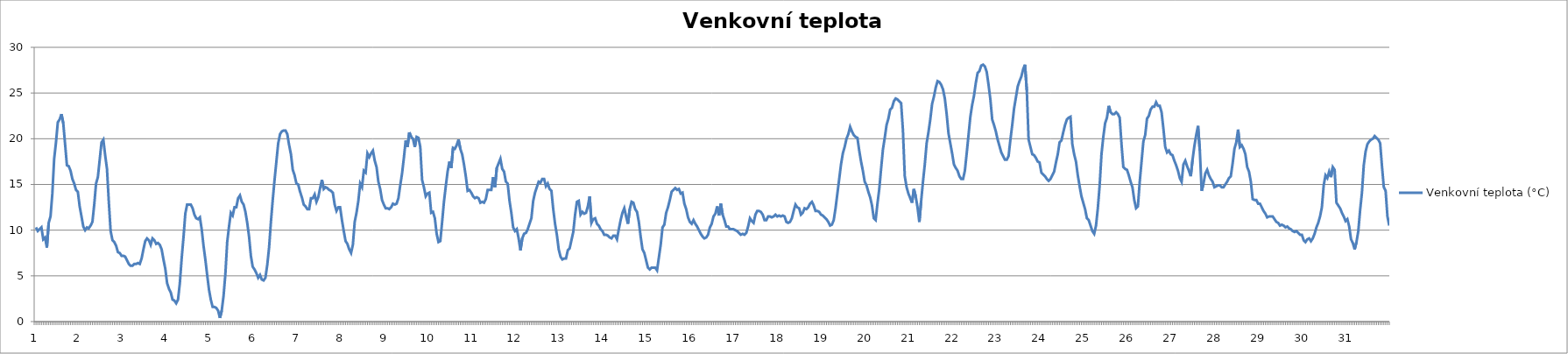
| Category | Venkovní teplota (°C) |
|---|---|
| 0 | 10.3 |
| 1 | 9.9 |
| 2 | 10.1 |
| 3 | 10.3 |
| 4 | 9 |
| 5 | 9.2 |
| 6 | 8.1 |
| 7 | 10.8 |
| 8 | 11.5 |
| 9 | 14 |
| 10 | 17.8 |
| 11 | 19.6 |
| 12 | 21.8 |
| 13 | 22.1 |
| 14 | 22.7 |
| 15 | 21.7 |
| 16 | 19.4 |
| 17 | 17.1 |
| 18 | 17 |
| 19 | 16.5 |
| 20 | 15.6 |
| 21 | 15.1 |
| 22 | 14.4 |
| 23 | 14.2 |
| 24 | 12.6 |
| 25 | 11.5 |
| 26 | 10.4 |
| 27 | 10 |
| 28 | 10.3 |
| 29 | 10.2 |
| 30 | 10.5 |
| 31 | 10.9 |
| 32 | 12.8 |
| 33 | 15.1 |
| 34 | 15.8 |
| 35 | 17.7 |
| 36 | 19.6 |
| 37 | 19.9 |
| 38 | 18.2 |
| 39 | 16.7 |
| 40 | 13.1 |
| 41 | 9.9 |
| 42 | 8.9 |
| 43 | 8.7 |
| 44 | 8.3 |
| 45 | 7.6 |
| 46 | 7.5 |
| 47 | 7.2 |
| 48 | 7.2 |
| 49 | 7.1 |
| 50 | 6.7 |
| 51 | 6.3 |
| 52 | 6.1 |
| 53 | 6.1 |
| 54 | 6.3 |
| 55 | 6.3 |
| 56 | 6.4 |
| 57 | 6.3 |
| 58 | 6.9 |
| 59 | 7.9 |
| 60 | 8.8 |
| 61 | 9.1 |
| 62 | 8.9 |
| 63 | 8.4 |
| 64 | 9.1 |
| 65 | 8.9 |
| 66 | 8.5 |
| 67 | 8.6 |
| 68 | 8.4 |
| 69 | 7.9 |
| 70 | 6.8 |
| 71 | 5.8 |
| 72 | 4.2 |
| 73 | 3.6 |
| 74 | 3.2 |
| 75 | 2.4 |
| 76 | 2.3 |
| 77 | 2 |
| 78 | 2.4 |
| 79 | 4.2 |
| 80 | 6.9 |
| 81 | 9.2 |
| 82 | 11.8 |
| 83 | 12.8 |
| 84 | 12.8 |
| 85 | 12.8 |
| 86 | 12.4 |
| 87 | 11.7 |
| 88 | 11.3 |
| 89 | 11.2 |
| 90 | 11.4 |
| 91 | 10.1 |
| 92 | 8.3 |
| 93 | 6.8 |
| 94 | 5.1 |
| 95 | 3.5 |
| 96 | 2.4 |
| 97 | 1.6 |
| 98 | 1.6 |
| 99 | 1.5 |
| 100 | 1.2 |
| 101 | 0.4 |
| 102 | 1.2 |
| 103 | 2.8 |
| 104 | 5.2 |
| 105 | 8.7 |
| 106 | 10.4 |
| 107 | 11.9 |
| 108 | 11.6 |
| 109 | 12.5 |
| 110 | 12.5 |
| 111 | 13.5 |
| 112 | 13.8 |
| 113 | 13.1 |
| 114 | 12.8 |
| 115 | 12 |
| 116 | 10.8 |
| 117 | 9.3 |
| 118 | 7.2 |
| 119 | 6 |
| 120 | 5.7 |
| 121 | 5.3 |
| 122 | 4.8 |
| 123 | 5.1 |
| 124 | 4.6 |
| 125 | 4.5 |
| 126 | 4.8 |
| 127 | 6.2 |
| 128 | 8.1 |
| 129 | 10.9 |
| 130 | 13.3 |
| 131 | 15.5 |
| 132 | 17.5 |
| 133 | 19.5 |
| 134 | 20.5 |
| 135 | 20.8 |
| 136 | 20.9 |
| 137 | 20.9 |
| 138 | 20.5 |
| 139 | 19.3 |
| 140 | 18.3 |
| 141 | 16.6 |
| 142 | 16 |
| 143 | 15.1 |
| 144 | 15 |
| 145 | 14.2 |
| 146 | 13.6 |
| 147 | 12.8 |
| 148 | 12.6 |
| 149 | 12.3 |
| 150 | 12.3 |
| 151 | 13.5 |
| 152 | 13.5 |
| 153 | 13.9 |
| 154 | 13.1 |
| 155 | 13.6 |
| 156 | 14.6 |
| 157 | 15.5 |
| 158 | 14.5 |
| 159 | 14.7 |
| 160 | 14.6 |
| 161 | 14.4 |
| 162 | 14.3 |
| 163 | 14.1 |
| 164 | 12.8 |
| 165 | 12.1 |
| 166 | 12.5 |
| 167 | 12.5 |
| 168 | 11.1 |
| 169 | 9.9 |
| 170 | 8.8 |
| 171 | 8.5 |
| 172 | 7.9 |
| 173 | 7.5 |
| 174 | 8.4 |
| 175 | 10.9 |
| 176 | 11.9 |
| 177 | 13.2 |
| 178 | 15.1 |
| 179 | 14.7 |
| 180 | 16.5 |
| 181 | 16.3 |
| 182 | 18.4 |
| 183 | 18 |
| 184 | 18.4 |
| 185 | 18.7 |
| 186 | 17.6 |
| 187 | 16.9 |
| 188 | 15.3 |
| 189 | 14.5 |
| 190 | 13.3 |
| 191 | 12.8 |
| 192 | 12.4 |
| 193 | 12.4 |
| 194 | 12.3 |
| 195 | 12.5 |
| 196 | 12.9 |
| 197 | 12.8 |
| 198 | 12.9 |
| 199 | 13.5 |
| 200 | 14.9 |
| 201 | 16.2 |
| 202 | 17.9 |
| 203 | 19.8 |
| 204 | 19.1 |
| 205 | 20.7 |
| 206 | 20.2 |
| 207 | 20 |
| 208 | 19.1 |
| 209 | 20.2 |
| 210 | 20.1 |
| 211 | 19.1 |
| 212 | 15.5 |
| 213 | 14.7 |
| 214 | 13.7 |
| 215 | 14 |
| 216 | 14.1 |
| 217 | 11.9 |
| 218 | 12 |
| 219 | 11.3 |
| 220 | 9.6 |
| 221 | 8.7 |
| 222 | 8.8 |
| 223 | 10.9 |
| 224 | 13.1 |
| 225 | 14.8 |
| 226 | 16.4 |
| 227 | 17.5 |
| 228 | 16.8 |
| 229 | 19 |
| 230 | 18.9 |
| 231 | 19.3 |
| 232 | 19.9 |
| 233 | 18.9 |
| 234 | 18.3 |
| 235 | 17.2 |
| 236 | 15.9 |
| 237 | 14.3 |
| 238 | 14.4 |
| 239 | 14.1 |
| 240 | 13.7 |
| 241 | 13.5 |
| 242 | 13.6 |
| 243 | 13.5 |
| 244 | 13 |
| 245 | 13.1 |
| 246 | 13 |
| 247 | 13.4 |
| 248 | 14.4 |
| 249 | 14.4 |
| 250 | 14.4 |
| 251 | 15.8 |
| 252 | 14.7 |
| 253 | 16.8 |
| 254 | 17.3 |
| 255 | 17.8 |
| 256 | 16.7 |
| 257 | 16.4 |
| 258 | 15.3 |
| 259 | 15.1 |
| 260 | 13.2 |
| 261 | 11.9 |
| 262 | 10.3 |
| 263 | 9.9 |
| 264 | 10.1 |
| 265 | 9.1 |
| 266 | 7.8 |
| 267 | 9.1 |
| 268 | 9.6 |
| 269 | 9.7 |
| 270 | 10.1 |
| 271 | 10.7 |
| 272 | 11.3 |
| 273 | 13.2 |
| 274 | 14.1 |
| 275 | 14.7 |
| 276 | 15.3 |
| 277 | 15.2 |
| 278 | 15.6 |
| 279 | 15.6 |
| 280 | 14.8 |
| 281 | 15.1 |
| 282 | 14.5 |
| 283 | 14.3 |
| 284 | 12.3 |
| 285 | 10.7 |
| 286 | 9.5 |
| 287 | 7.9 |
| 288 | 7.1 |
| 289 | 6.8 |
| 290 | 6.9 |
| 291 | 6.9 |
| 292 | 7.8 |
| 293 | 8 |
| 294 | 8.9 |
| 295 | 9.8 |
| 296 | 11.7 |
| 297 | 13.1 |
| 298 | 13.2 |
| 299 | 11.7 |
| 300 | 12 |
| 301 | 11.8 |
| 302 | 11.9 |
| 303 | 12.6 |
| 304 | 13.7 |
| 305 | 10.8 |
| 306 | 11.2 |
| 307 | 11.3 |
| 308 | 10.7 |
| 309 | 10.5 |
| 310 | 10.1 |
| 311 | 9.9 |
| 312 | 9.5 |
| 313 | 9.5 |
| 314 | 9.4 |
| 315 | 9.2 |
| 316 | 9.1 |
| 317 | 9.4 |
| 318 | 9.4 |
| 319 | 9 |
| 320 | 10.1 |
| 321 | 11.1 |
| 322 | 11.9 |
| 323 | 12.4 |
| 324 | 11.5 |
| 325 | 10.7 |
| 326 | 12.3 |
| 327 | 13.1 |
| 328 | 13 |
| 329 | 12.3 |
| 330 | 12 |
| 331 | 10.9 |
| 332 | 9.3 |
| 333 | 7.9 |
| 334 | 7.5 |
| 335 | 6.7 |
| 336 | 5.9 |
| 337 | 5.7 |
| 338 | 5.9 |
| 339 | 5.9 |
| 340 | 5.9 |
| 341 | 5.6 |
| 342 | 7 |
| 343 | 8.4 |
| 344 | 10.3 |
| 345 | 10.6 |
| 346 | 11.9 |
| 347 | 12.5 |
| 348 | 13.3 |
| 349 | 14.2 |
| 350 | 14.4 |
| 351 | 14.6 |
| 352 | 14.4 |
| 353 | 14.5 |
| 354 | 14 |
| 355 | 14.1 |
| 356 | 12.9 |
| 357 | 12.3 |
| 358 | 11.4 |
| 359 | 10.9 |
| 360 | 10.7 |
| 361 | 11.1 |
| 362 | 10.7 |
| 363 | 10.4 |
| 364 | 10 |
| 365 | 9.6 |
| 366 | 9.3 |
| 367 | 9.1 |
| 368 | 9.2 |
| 369 | 9.5 |
| 370 | 10.3 |
| 371 | 10.7 |
| 372 | 11.5 |
| 373 | 11.8 |
| 374 | 12.6 |
| 375 | 11.6 |
| 376 | 12.9 |
| 377 | 11.7 |
| 378 | 11.1 |
| 379 | 10.4 |
| 380 | 10.4 |
| 381 | 10.1 |
| 382 | 10.1 |
| 383 | 10.1 |
| 384 | 10 |
| 385 | 9.9 |
| 386 | 9.7 |
| 387 | 9.5 |
| 388 | 9.6 |
| 389 | 9.5 |
| 390 | 9.7 |
| 391 | 10.4 |
| 392 | 11.3 |
| 393 | 11 |
| 394 | 10.8 |
| 395 | 11.7 |
| 396 | 12.1 |
| 397 | 12.1 |
| 398 | 12 |
| 399 | 11.7 |
| 400 | 11.1 |
| 401 | 11.1 |
| 402 | 11.5 |
| 403 | 11.5 |
| 404 | 11.4 |
| 405 | 11.5 |
| 406 | 11.7 |
| 407 | 11.5 |
| 408 | 11.6 |
| 409 | 11.5 |
| 410 | 11.6 |
| 411 | 11.5 |
| 412 | 10.9 |
| 413 | 10.8 |
| 414 | 10.9 |
| 415 | 11.3 |
| 416 | 12.1 |
| 417 | 12.8 |
| 418 | 12.5 |
| 419 | 12.4 |
| 420 | 11.7 |
| 421 | 11.9 |
| 422 | 12.4 |
| 423 | 12.3 |
| 424 | 12.5 |
| 425 | 12.9 |
| 426 | 13.1 |
| 427 | 12.7 |
| 428 | 12.1 |
| 429 | 12.1 |
| 430 | 12 |
| 431 | 11.7 |
| 432 | 11.6 |
| 433 | 11.4 |
| 434 | 11.2 |
| 435 | 10.9 |
| 436 | 10.5 |
| 437 | 10.6 |
| 438 | 11.1 |
| 439 | 12.4 |
| 440 | 14 |
| 441 | 15.6 |
| 442 | 17.2 |
| 443 | 18.4 |
| 444 | 19.1 |
| 445 | 20 |
| 446 | 20.5 |
| 447 | 21.3 |
| 448 | 20.8 |
| 449 | 20.4 |
| 450 | 20.2 |
| 451 | 20.1 |
| 452 | 18.7 |
| 453 | 17.5 |
| 454 | 16.5 |
| 455 | 15.3 |
| 456 | 14.9 |
| 457 | 14.2 |
| 458 | 13.6 |
| 459 | 12.7 |
| 460 | 11.3 |
| 461 | 11.1 |
| 462 | 12.9 |
| 463 | 14.5 |
| 464 | 16.7 |
| 465 | 18.8 |
| 466 | 20.1 |
| 467 | 21.5 |
| 468 | 22.2 |
| 469 | 23.2 |
| 470 | 23.4 |
| 471 | 24.1 |
| 472 | 24.4 |
| 473 | 24.3 |
| 474 | 24.1 |
| 475 | 23.9 |
| 476 | 20.9 |
| 477 | 15.9 |
| 478 | 14.7 |
| 479 | 14 |
| 480 | 13.5 |
| 481 | 13 |
| 482 | 14.5 |
| 483 | 13.7 |
| 484 | 12.5 |
| 485 | 10.9 |
| 486 | 13.2 |
| 487 | 15.3 |
| 488 | 17.2 |
| 489 | 19.5 |
| 490 | 20.7 |
| 491 | 22.1 |
| 492 | 23.8 |
| 493 | 24.6 |
| 494 | 25.6 |
| 495 | 26.3 |
| 496 | 26.2 |
| 497 | 25.9 |
| 498 | 25.4 |
| 499 | 24.4 |
| 500 | 22.7 |
| 501 | 20.6 |
| 502 | 19.5 |
| 503 | 18.4 |
| 504 | 17.2 |
| 505 | 16.8 |
| 506 | 16.5 |
| 507 | 15.9 |
| 508 | 15.6 |
| 509 | 15.6 |
| 510 | 16.5 |
| 511 | 18.4 |
| 512 | 20.4 |
| 513 | 22.4 |
| 514 | 23.7 |
| 515 | 24.7 |
| 516 | 26.1 |
| 517 | 27.2 |
| 518 | 27.4 |
| 519 | 28 |
| 520 | 28.1 |
| 521 | 27.9 |
| 522 | 27.3 |
| 523 | 25.9 |
| 524 | 24.3 |
| 525 | 22.1 |
| 526 | 21.5 |
| 527 | 20.8 |
| 528 | 19.9 |
| 529 | 19.2 |
| 530 | 18.5 |
| 531 | 18.1 |
| 532 | 17.7 |
| 533 | 17.7 |
| 534 | 18.1 |
| 535 | 19.9 |
| 536 | 21.5 |
| 537 | 23.3 |
| 538 | 24.5 |
| 539 | 25.7 |
| 540 | 26.3 |
| 541 | 26.8 |
| 542 | 27.6 |
| 543 | 28.1 |
| 544 | 25.3 |
| 545 | 19.9 |
| 546 | 19.1 |
| 547 | 18.3 |
| 548 | 18.2 |
| 549 | 17.9 |
| 550 | 17.5 |
| 551 | 17.4 |
| 552 | 16.3 |
| 553 | 16.1 |
| 554 | 15.9 |
| 555 | 15.6 |
| 556 | 15.4 |
| 557 | 15.6 |
| 558 | 16 |
| 559 | 16.4 |
| 560 | 17.4 |
| 561 | 18.3 |
| 562 | 19.6 |
| 563 | 19.8 |
| 564 | 20.7 |
| 565 | 21.5 |
| 566 | 22.1 |
| 567 | 22.3 |
| 568 | 22.4 |
| 569 | 19.4 |
| 570 | 18.3 |
| 571 | 17.5 |
| 572 | 16 |
| 573 | 14.8 |
| 574 | 13.7 |
| 575 | 13 |
| 576 | 12.3 |
| 577 | 11.3 |
| 578 | 11.1 |
| 579 | 10.5 |
| 580 | 9.9 |
| 581 | 9.6 |
| 582 | 10.5 |
| 583 | 12.4 |
| 584 | 14.9 |
| 585 | 18.3 |
| 586 | 20.2 |
| 587 | 21.7 |
| 588 | 22.3 |
| 589 | 23.6 |
| 590 | 22.9 |
| 591 | 22.7 |
| 592 | 22.7 |
| 593 | 22.9 |
| 594 | 22.7 |
| 595 | 22.3 |
| 596 | 19.4 |
| 597 | 16.9 |
| 598 | 16.7 |
| 599 | 16.6 |
| 600 | 16 |
| 601 | 15.3 |
| 602 | 14.7 |
| 603 | 13.3 |
| 604 | 12.4 |
| 605 | 12.6 |
| 606 | 15.3 |
| 607 | 17.5 |
| 608 | 19.7 |
| 609 | 20.4 |
| 610 | 22.2 |
| 611 | 22.5 |
| 612 | 23.2 |
| 613 | 23.5 |
| 614 | 23.5 |
| 615 | 24 |
| 616 | 23.6 |
| 617 | 23.6 |
| 618 | 22.9 |
| 619 | 21.1 |
| 620 | 19.1 |
| 621 | 18.5 |
| 622 | 18.7 |
| 623 | 18.3 |
| 624 | 18.2 |
| 625 | 17.6 |
| 626 | 17.1 |
| 627 | 16.5 |
| 628 | 15.7 |
| 629 | 15.3 |
| 630 | 17.2 |
| 631 | 17.6 |
| 632 | 17 |
| 633 | 16.5 |
| 634 | 15.9 |
| 635 | 17.7 |
| 636 | 19.2 |
| 637 | 20.4 |
| 638 | 21.4 |
| 639 | 18.7 |
| 640 | 14.3 |
| 641 | 15.1 |
| 642 | 16.2 |
| 643 | 16.6 |
| 644 | 16 |
| 645 | 15.6 |
| 646 | 15.3 |
| 647 | 14.7 |
| 648 | 14.8 |
| 649 | 14.9 |
| 650 | 14.9 |
| 651 | 14.7 |
| 652 | 14.7 |
| 653 | 15 |
| 654 | 15.3 |
| 655 | 15.7 |
| 656 | 15.9 |
| 657 | 17.3 |
| 658 | 18.9 |
| 659 | 19.6 |
| 660 | 21 |
| 661 | 19.1 |
| 662 | 19.3 |
| 663 | 18.9 |
| 664 | 18.3 |
| 665 | 16.9 |
| 666 | 16.4 |
| 667 | 15.3 |
| 668 | 13.4 |
| 669 | 13.3 |
| 670 | 13.3 |
| 671 | 12.9 |
| 672 | 12.9 |
| 673 | 12.5 |
| 674 | 12.1 |
| 675 | 11.8 |
| 676 | 11.4 |
| 677 | 11.5 |
| 678 | 11.5 |
| 679 | 11.5 |
| 680 | 11.2 |
| 681 | 10.9 |
| 682 | 10.8 |
| 683 | 10.5 |
| 684 | 10.6 |
| 685 | 10.5 |
| 686 | 10.3 |
| 687 | 10.4 |
| 688 | 10.2 |
| 689 | 10.1 |
| 690 | 9.9 |
| 691 | 9.8 |
| 692 | 9.9 |
| 693 | 9.7 |
| 694 | 9.5 |
| 695 | 9.5 |
| 696 | 8.9 |
| 697 | 8.7 |
| 698 | 9 |
| 699 | 9.1 |
| 700 | 8.8 |
| 701 | 9.1 |
| 702 | 9.6 |
| 703 | 10.3 |
| 704 | 10.8 |
| 705 | 11.5 |
| 706 | 12.5 |
| 707 | 14.9 |
| 708 | 16 |
| 709 | 15.7 |
| 710 | 16.4 |
| 711 | 15.8 |
| 712 | 16.9 |
| 713 | 16.6 |
| 714 | 13 |
| 715 | 12.7 |
| 716 | 12.4 |
| 717 | 11.9 |
| 718 | 11.5 |
| 719 | 11 |
| 720 | 11.2 |
| 721 | 10.4 |
| 722 | 9 |
| 723 | 8.6 |
| 724 | 7.9 |
| 725 | 8.7 |
| 726 | 9.9 |
| 727 | 12.2 |
| 728 | 14.1 |
| 729 | 17.1 |
| 730 | 18.6 |
| 731 | 19.4 |
| 732 | 19.7 |
| 733 | 19.9 |
| 734 | 20 |
| 735 | 20.3 |
| 736 | 20.1 |
| 737 | 19.9 |
| 738 | 19.5 |
| 739 | 17 |
| 740 | 14.7 |
| 741 | 14.3 |
| 742 | 11.5 |
| 743 | 10.5 |